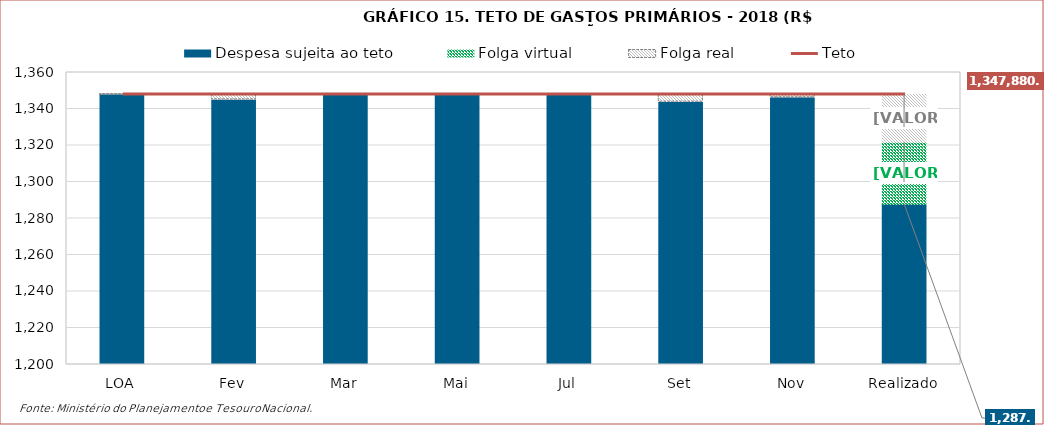
| Category | Despesa sujeita ao teto | Folga virtual | Folga real |
|---|---|---|---|
| LOA | 1347875.2 | 0 | 5.5 |
| Fev | 1344987.1 | 0 | 2893.6 |
| Mar | 1347448.8 | 0 | 431.9 |
| Mai | 1347409.2 | 0 | 471.5 |
| Jul | 1347880.7 | 0 | 0 |
| Set | 1343756.5 | 0 | 4124.2 |
| Nov | 1346131.1 | 0 | 1749.6 |
| Realizado | 1287797.002 | 34000 | 26083.698 |